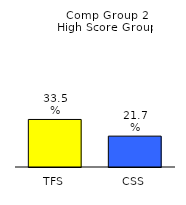
| Category | Series 0 |
|---|---|
| TFS | 0.335 |
| CSS | 0.217 |